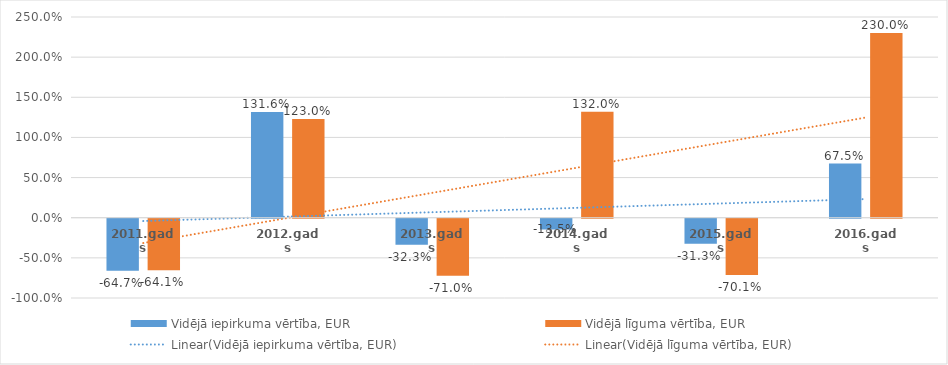
| Category | Vidējā iepirkuma vērtība, EUR | Vidējā līguma vērtība, EUR |
|---|---|---|
| 2011.gads | -0.647 | -0.641 |
| 2012.gads | 1.316 | 1.23 |
| 2013.gads | -0.323 | -0.71 |
| 2014.gads | -0.135 | 1.32 |
| 2015.gads | -0.313 | -0.701 |
| 2016.gads | 0.675 | 2.3 |